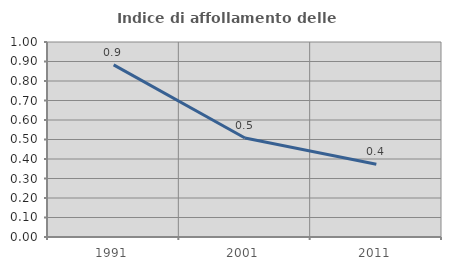
| Category | Indice di affollamento delle abitazioni  |
|---|---|
| 1991.0 | 0.883 |
| 2001.0 | 0.507 |
| 2011.0 | 0.373 |